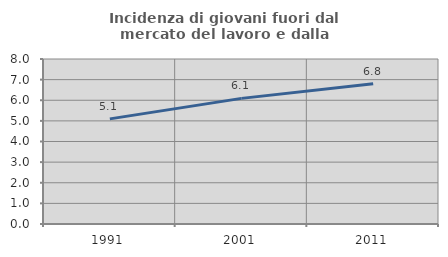
| Category | Incidenza di giovani fuori dal mercato del lavoro e dalla formazione  |
|---|---|
| 1991.0 | 5.098 |
| 2001.0 | 6.091 |
| 2011.0 | 6.794 |